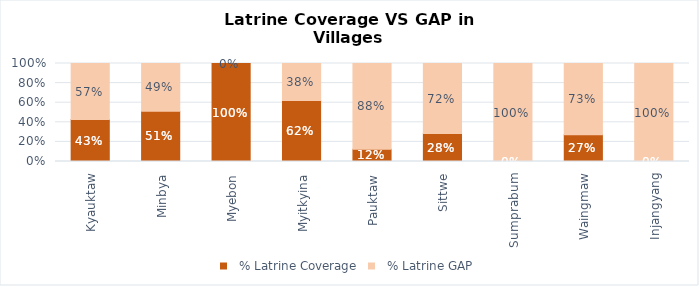
| Category |   % Latrine Coverage |   % Latrine GAP |
|---|---|---|
| Kyauktaw | 0.429 | 0.571 |
| Minbya | 0.513 | 0.487 |
| Myebon | 1 | 0 |
| Myitkyina | 0.622 | 0.378 |
| Pauktaw | 0.125 | 0.875 |
| Sittwe | 0.285 | 0.715 |
| Sumprabum | 0 | 1 |
| Waingmaw | 0.272 | 0.728 |
| Injangyang | 0 | 1 |